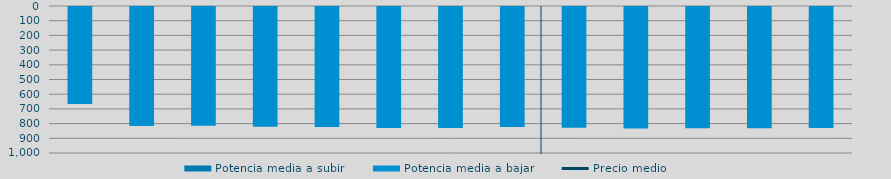
| Category | Potencia media a subir | Potencia media a bajar |
|---|---|---|
| 0 |  | 659.7 |
| 1 |  | 809.502 |
| 2 |  | 808.05 |
| 3 |  | 814.726 |
| 4 |  | 815.741 |
| 5 |  | 822.445 |
| 6 |  | 823.829 |
| 7 |  | 816.372 |
| 8 |  | 821.408 |
| 9 |  | 825.952 |
| 10 |  | 824.183 |
| 11 |  | 824.381 |
| 12 |  | 823.337 |